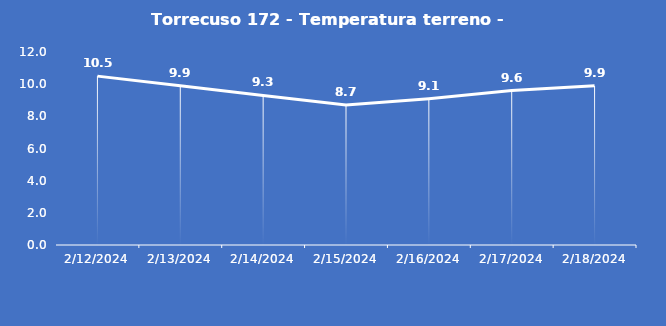
| Category | Torrecuso 172 - Temperatura terreno - Grezzo (°C) |
|---|---|
| 2/12/24 | 10.5 |
| 2/13/24 | 9.9 |
| 2/14/24 | 9.3 |
| 2/15/24 | 8.7 |
| 2/16/24 | 9.1 |
| 2/17/24 | 9.6 |
| 2/18/24 | 9.9 |